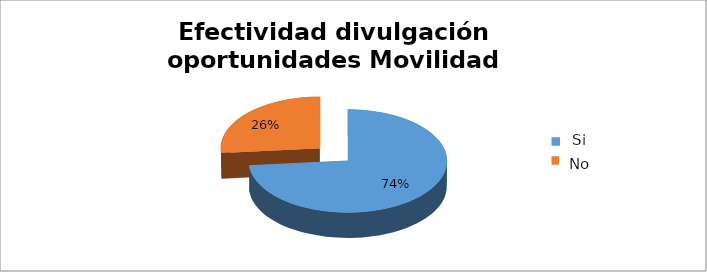
| Category | Series 0 |
|---|---|
| 0 | 0.735 |
| 1 | 0.265 |